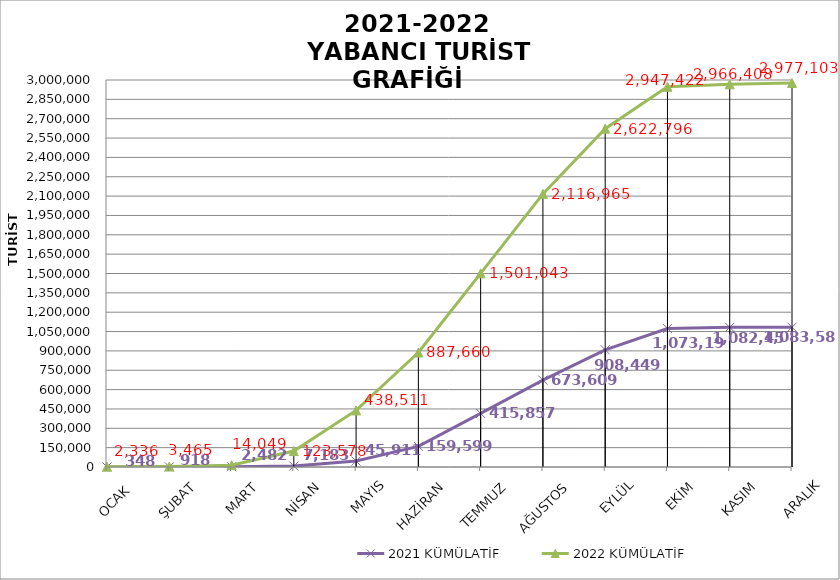
| Category | 2021 KÜMÜLATİF  | 2022 KÜMÜLATİF  |
|---|---|---|
| OCAK  | 348 | 2336 |
| ŞUBAT | 918 | 3465 |
| MART | 2482 | 14049 |
| NİSAN | 7183 | 123578 |
| MAYIS | 45911 | 438511 |
| HAZİRAN | 159599 | 887660 |
| TEMMUZ | 415857 | 1501043 |
| AĞUSTOS | 673609 | 2116965 |
| EYLÜL | 908449 | 2622796 |
| EKİM | 1073199 | 2947422 |
| KASIM | 1082450 | 2966408 |
| ARALIK | 1083589 | 2977103 |